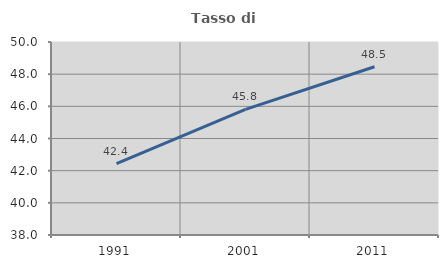
| Category | Tasso di occupazione   |
|---|---|
| 1991.0 | 42.431 |
| 2001.0 | 45.808 |
| 2011.0 | 48.46 |